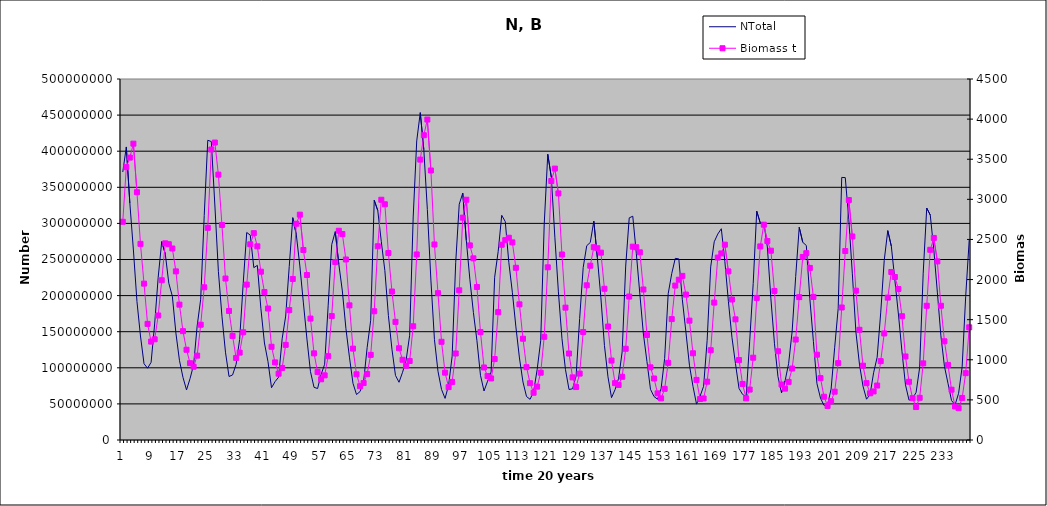
| Category | NTotal |
|---|---|
| 0 | 371157476.458 |
| 1 | 405870772.65 |
| 2 | 328011525.205 |
| 3 | 263211305.025 |
| 4 | 191996850.323 |
| 5 | 144062726.625 |
| 6 | 105647804.04 |
| 7 | 99431287.46 |
| 8 | 107587498.986 |
| 9 | 160681539.616 |
| 10 | 225382956.001 |
| 11 | 274832633.191 |
| 12 | 257770627.179 |
| 13 | 217058695.61 |
| 14 | 199211154.251 |
| 15 | 148131321.688 |
| 16 | 110386564.283 |
| 17 | 86756581.326 |
| 18 | 69343428.822 |
| 19 | 85145091.103 |
| 20 | 103964053.679 |
| 21 | 157847934.059 |
| 22 | 195082999.434 |
| 23 | 310910902.712 |
| 24 | 415154313.233 |
| 25 | 413329879.295 |
| 26 | 325498836.993 |
| 27 | 233369778.428 |
| 28 | 171483948.852 |
| 29 | 121637516.994 |
| 30 | 87931429.049 |
| 31 | 90104951.523 |
| 32 | 104746676.21 |
| 33 | 139313966.855 |
| 34 | 216859790.084 |
| 35 | 287426983.132 |
| 36 | 283737515.477 |
| 37 | 238735530.541 |
| 38 | 241877617.946 |
| 39 | 181840401.417 |
| 40 | 134364631.186 |
| 41 | 108665062.775 |
| 42 | 72398420.459 |
| 43 | 80831514.517 |
| 44 | 87059789.854 |
| 45 | 140134471.128 |
| 46 | 171699577.049 |
| 47 | 240076795.579 |
| 48 | 307916318.689 |
| 49 | 284278644.997 |
| 50 | 241050443.544 |
| 51 | 189899585.666 |
| 52 | 139695397.416 |
| 53 | 94697488.907 |
| 54 | 72994255.773 |
| 55 | 71276517.358 |
| 56 | 90760181.599 |
| 57 | 104841772.467 |
| 58 | 186737031.88 |
| 59 | 270713265.083 |
| 60 | 288646364.884 |
| 61 | 243448368.344 |
| 62 | 206424325.986 |
| 63 | 154650506.901 |
| 64 | 114715373.61 |
| 65 | 78527381.574 |
| 66 | 62978074.9 |
| 67 | 67129842.085 |
| 68 | 80996648.359 |
| 69 | 128014338.649 |
| 70 | 165875991.566 |
| 71 | 332072496.937 |
| 72 | 317831525.501 |
| 73 | 274572626.396 |
| 74 | 234680578.069 |
| 75 | 172404897.579 |
| 76 | 125739243.096 |
| 77 | 89437747.279 |
| 78 | 79981500.177 |
| 79 | 93854246.819 |
| 80 | 110428011.208 |
| 81 | 145037817.105 |
| 82 | 308893732.692 |
| 83 | 414251300.584 |
| 84 | 453420060.555 |
| 85 | 402086314.546 |
| 86 | 319198440.575 |
| 87 | 221488560.238 |
| 88 | 139113134.195 |
| 89 | 95276994.329 |
| 90 | 70038425.076 |
| 91 | 57644582.7 |
| 92 | 75876317.239 |
| 93 | 116058700.831 |
| 94 | 245582911.235 |
| 95 | 326532733.016 |
| 96 | 341953533.848 |
| 97 | 276290726.89 |
| 98 | 222721266.584 |
| 99 | 176692375.514 |
| 100 | 137442156.048 |
| 101 | 89616755.047 |
| 102 | 67871284.597 |
| 103 | 81416459.531 |
| 104 | 94222717.333 |
| 105 | 225478912.432 |
| 106 | 261315762.465 |
| 107 | 311221146.136 |
| 108 | 302503173.873 |
| 109 | 245949362.231 |
| 110 | 204655483.874 |
| 111 | 156616043.718 |
| 112 | 113617605.954 |
| 113 | 80291517.313 |
| 114 | 60225420.968 |
| 115 | 56378624.108 |
| 116 | 67072267.294 |
| 117 | 97330506.699 |
| 118 | 137406198.997 |
| 119 | 299249310.816 |
| 120 | 395792602.04 |
| 121 | 364116210.78 |
| 122 | 280931884.986 |
| 123 | 205213514.107 |
| 124 | 140776449.977 |
| 125 | 97466414.69 |
| 126 | 69910241.25 |
| 127 | 70982523.422 |
| 128 | 88480224.662 |
| 129 | 168220951.407 |
| 130 | 238930980.135 |
| 131 | 269089610.239 |
| 132 | 273547262.686 |
| 133 | 303109330.161 |
| 134 | 252531533.004 |
| 135 | 196953080.809 |
| 136 | 130918787.215 |
| 137 | 87465772.317 |
| 138 | 58628265.843 |
| 139 | 69779013.926 |
| 140 | 85566134.2 |
| 141 | 122000750.563 |
| 142 | 240925009.923 |
| 143 | 307655668.139 |
| 144 | 309928778.145 |
| 145 | 258574036.941 |
| 146 | 202176338.141 |
| 147 | 146835401.304 |
| 148 | 108737055.156 |
| 149 | 70249069.55 |
| 150 | 60194367.759 |
| 151 | 56492420.175 |
| 152 | 71193426.442 |
| 153 | 113041623.664 |
| 154 | 202617842.373 |
| 155 | 230477114.198 |
| 156 | 251562739.025 |
| 157 | 250879568.197 |
| 158 | 194281981.755 |
| 159 | 149670748.423 |
| 160 | 103630595.125 |
| 161 | 74334188.021 |
| 162 | 49690420.747 |
| 163 | 60662755.768 |
| 164 | 74334794.17 |
| 165 | 138115400.145 |
| 166 | 239765871.174 |
| 167 | 274554766.04 |
| 168 | 285227979.477 |
| 169 | 292615430.815 |
| 170 | 247454023.164 |
| 171 | 192033236.45 |
| 172 | 142212610.852 |
| 173 | 105767018.933 |
| 174 | 71394481.548 |
| 175 | 63159882.099 |
| 176 | 59848955.788 |
| 177 | 135961746.215 |
| 178 | 216704277.267 |
| 179 | 316966136.659 |
| 180 | 300660162.943 |
| 181 | 300903047.589 |
| 182 | 267357655.168 |
| 183 | 195585798.02 |
| 184 | 133983659.361 |
| 185 | 87730200.564 |
| 186 | 65422632.782 |
| 187 | 81818909.333 |
| 188 | 105673814.507 |
| 189 | 150504107.018 |
| 190 | 226567740.477 |
| 191 | 294585420.815 |
| 192 | 273799004.088 |
| 193 | 269398790.253 |
| 194 | 195576058.793 |
| 195 | 136634558.942 |
| 196 | 78078323.014 |
| 197 | 58126382.369 |
| 198 | 47859988.928 |
| 199 | 49120982.338 |
| 200 | 70486644.306 |
| 201 | 127725313.555 |
| 202 | 182502191.703 |
| 203 | 363686496.58 |
| 204 | 363419923.401 |
| 205 | 305074419.631 |
| 206 | 230168575.363 |
| 207 | 149755604.267 |
| 208 | 105126033.372 |
| 209 | 74707764.083 |
| 210 | 56507383.812 |
| 211 | 63019299.161 |
| 212 | 93138732.329 |
| 213 | 114610734.784 |
| 214 | 176012838.169 |
| 215 | 248853981.995 |
| 216 | 290000875.995 |
| 217 | 268550139.132 |
| 218 | 221661423.45 |
| 219 | 174498272.77 |
| 220 | 122911021.882 |
| 221 | 76429392.454 |
| 222 | 55196403.957 |
| 223 | 57455524.379 |
| 224 | 65924213.262 |
| 225 | 100269599.224 |
| 226 | 231061261.089 |
| 227 | 321294580.324 |
| 228 | 311586092.17 |
| 229 | 263466004.837 |
| 230 | 204805976.945 |
| 231 | 144235520.46 |
| 232 | 102003663.406 |
| 233 | 78553112.957 |
| 234 | 54730208.457 |
| 235 | 48657965.836 |
| 236 | 64654735.383 |
| 237 | 101306020.527 |
| 238 | 199067375.709 |
| 239 | 277132278.276 |